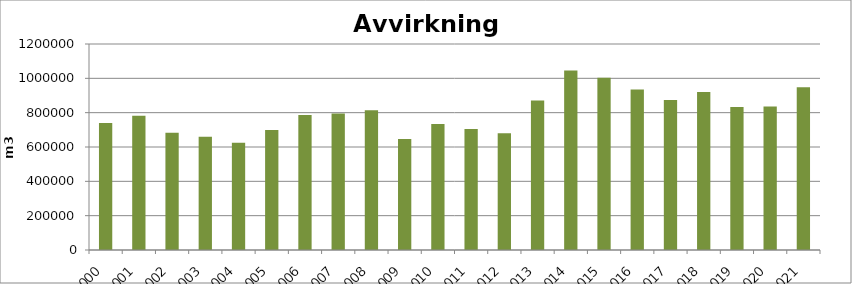
| Category | Totalt |
|---|---|
| 2000 | 739147 |
| 2001 | 782342 |
| 2002 | 682469 |
| 2003 | 659451 |
| 2004 | 625293 |
| 2005 | 698431 |
| 2006 | 787030 |
| 2007 | 795331 |
| 2008 | 813775 |
| 2009 | 646315 |
| 2010 | 733304 |
| 2011 | 704386 |
| 2012 | 680065 |
| 2013 | 870516 |
| 2014 | 1046122 |
| 2015 | 1003383 |
| 2016 | 934795 |
| 2017 | 873623 |
| 2018 | 920743 |
| 2019 | 832367 |
| 2020 | 836616 |
| 2021 | 948718 |